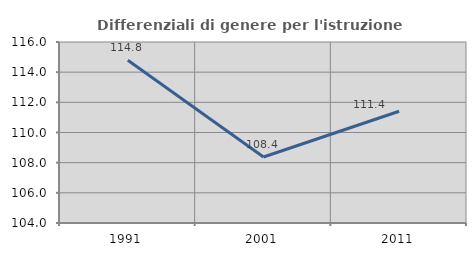
| Category | Differenziali di genere per l'istruzione superiore |
|---|---|
| 1991.0 | 114.791 |
| 2001.0 | 108.376 |
| 2011.0 | 111.408 |